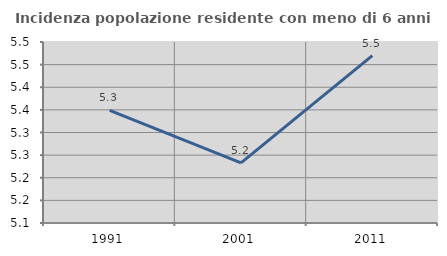
| Category | Incidenza popolazione residente con meno di 6 anni |
|---|---|
| 1991.0 | 5.349 |
| 2001.0 | 5.233 |
| 2011.0 | 5.47 |